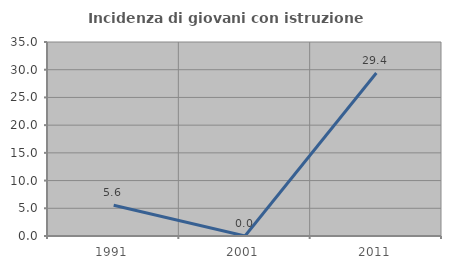
| Category | Incidenza di giovani con istruzione universitaria |
|---|---|
| 1991.0 | 5.556 |
| 2001.0 | 0 |
| 2011.0 | 29.412 |